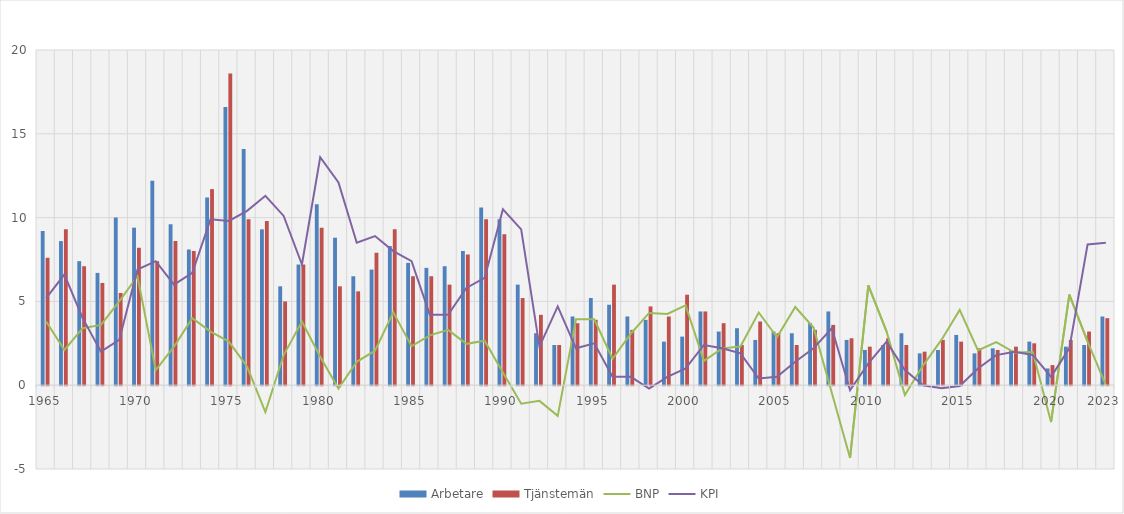
| Category | Arbetare | Tjänstemän |
|---|---|---|
| 1965 | 9.2 | 7.6 |
|  | 8.6 | 9.3 |
|  | 7.4 | 7.1 |
|  | 6.7 | 6.1 |
|  | 10 | 5.5 |
| 1970 | 9.4 | 8.2 |
|  | 12.2 | 7.4 |
|  | 9.6 | 8.6 |
|  | 8.1 | 8 |
|  | 11.2 | 11.7 |
| 1975 | 16.6 | 18.6 |
|  | 14.1 | 9.9 |
|  | 9.3 | 9.8 |
|  | 5.9 | 5 |
|  | 7.2 | 7.2 |
| 1980 | 10.8 | 9.4 |
|  | 8.8 | 5.9 |
|  | 6.5 | 5.6 |
|  | 6.9 | 7.9 |
|  | 8.3 | 9.3 |
| 1985 | 7.3 | 6.5 |
|  | 7 | 6.5 |
|  | 7.1 | 6 |
|  | 8 | 7.8 |
|  | 10.6 | 9.9 |
| 1990 | 9.9 | 9 |
|  | 6 | 5.2 |
|  | 3.1 | 4.2 |
|  | 2.4 | 2.4 |
|  | 4.1 | 3.7 |
| 1995 | 5.2 | 3.9 |
|  | 4.8 | 6 |
|  | 4.1 | 3.3 |
|  | 3.9 | 4.7 |
|  | 2.6 | 4.1 |
| 2000 | 2.9 | 5.4 |
|  | 4.4 | 4.4 |
|  | 3.2 | 3.7 |
|  | 3.4 | 2.4 |
|  | 2.7 | 3.8 |
| 2005 | 3.2 | 3.1 |
|  | 3.1 | 2.4 |
|  | 3.7 | 3.3 |
|  | 4.4 | 3.6 |
|  | 2.7 | 2.8 |
| 2010 | 2.1 | 2.3 |
|  | 2.4 | 2.8 |
|  | 3.1 | 2.4 |
|  | 1.9 | 2 |
|  | 2.1 | 2.7 |
| 2015 | 3 | 2.6 |
|  | 1.9 | 2.2 |
|  | 2.2 | 2.1 |
|  | 2.1 | 2.3 |
|  | 2.6 | 2.5 |
| 2020 | 1 | 1.2 |
|  | 2.3 | 2.7 |
|  | 2.4 | 3.2 |
| 2023 | 4.1 | 4 |